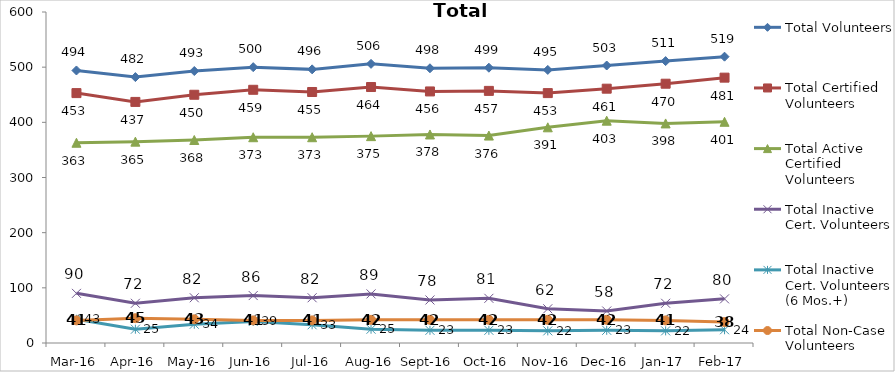
| Category | Total Volunteers | Total Certified Volunteers | Total Active Certified Volunteers | Total Inactive Cert. Volunteers | Total Inactive Cert. Volunteers (6 Mos.+) | Total Non-Case Volunteers |
|---|---|---|---|---|---|---|
| Mar-16 | 494 | 453 | 363 | 90 | 43 | 41 |
| Apr-16 | 482 | 437 | 365 | 72 | 25 | 45 |
| May-16 | 493 | 450 | 368 | 82 | 34 | 43 |
| Jun-16 | 500 | 459 | 373 | 86 | 39 | 41 |
| Jul-16 | 496 | 455 | 373 | 82 | 33 | 41 |
| Aug-16 | 506 | 464 | 375 | 89 | 25 | 42 |
| Sep-16 | 498 | 456 | 378 | 78 | 23 | 42 |
| Oct-16 | 499 | 457 | 376 | 81 | 23 | 42 |
| Nov-16 | 495 | 453 | 391 | 62 | 22 | 42 |
| Dec-16 | 503 | 461 | 403 | 58 | 23 | 42 |
| Jan-17 | 511 | 470 | 398 | 72 | 22 | 41 |
| Feb-17 | 519 | 481 | 401 | 80 | 24 | 38 |